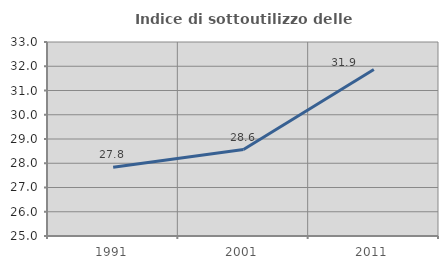
| Category | Indice di sottoutilizzo delle abitazioni  |
|---|---|
| 1991.0 | 27.839 |
| 2001.0 | 28.565 |
| 2011.0 | 31.87 |